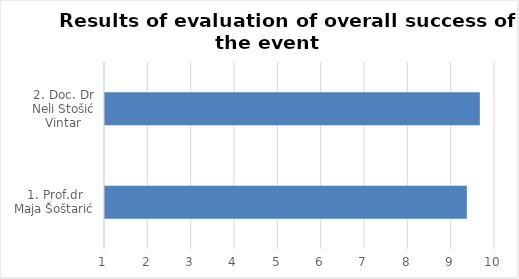
| Category | Series 0 |
|---|---|
| 1. Prof.dr Maja Šoštarić | 9.35 |
| 2. Doc. Dr Neli Stošić Vintar | 9.65 |